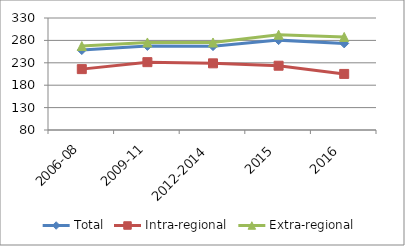
| Category | Total | Intra-regional | Extra-regional |
|---|---|---|---|
| 2006-08 | 258.42 | 215.893 | 267.404 |
| 2009-11 | 267.697 | 231.446 | 275.355 |
| 2012-2014 | 267.205 | 228.817 | 275.315 |
| 2015 | 280.609 | 223.48 | 292.678 |
| 2016 | 273.278 | 205.161 | 287.669 |